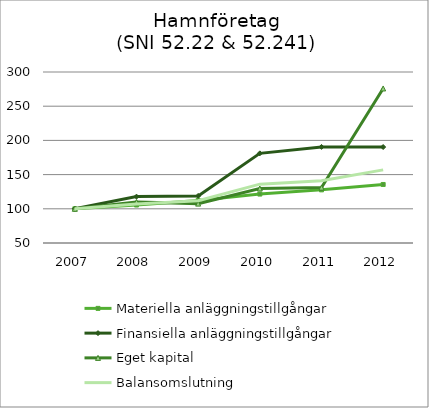
| Category | Materiella anläggningstillgångar | Finansiella anläggningstillgångar | Eget kapital | Balansomslutning |
|---|---|---|---|---|
| 0 | 100 | 100 | 100 | 100 |
| 1 | 105.532 | 117.812 | 109.928 | 107.128 |
| 2 | 112.204 | 118.858 | 107.569 | 111.813 |
| 3 | 121.539 | 181.074 | 129.699 | 136.071 |
| 4 | 127.699 | 190.486 | 130.969 | 140.882 |
| 5 | 135.563 | 190.305 | 275.925 | 156.917 |